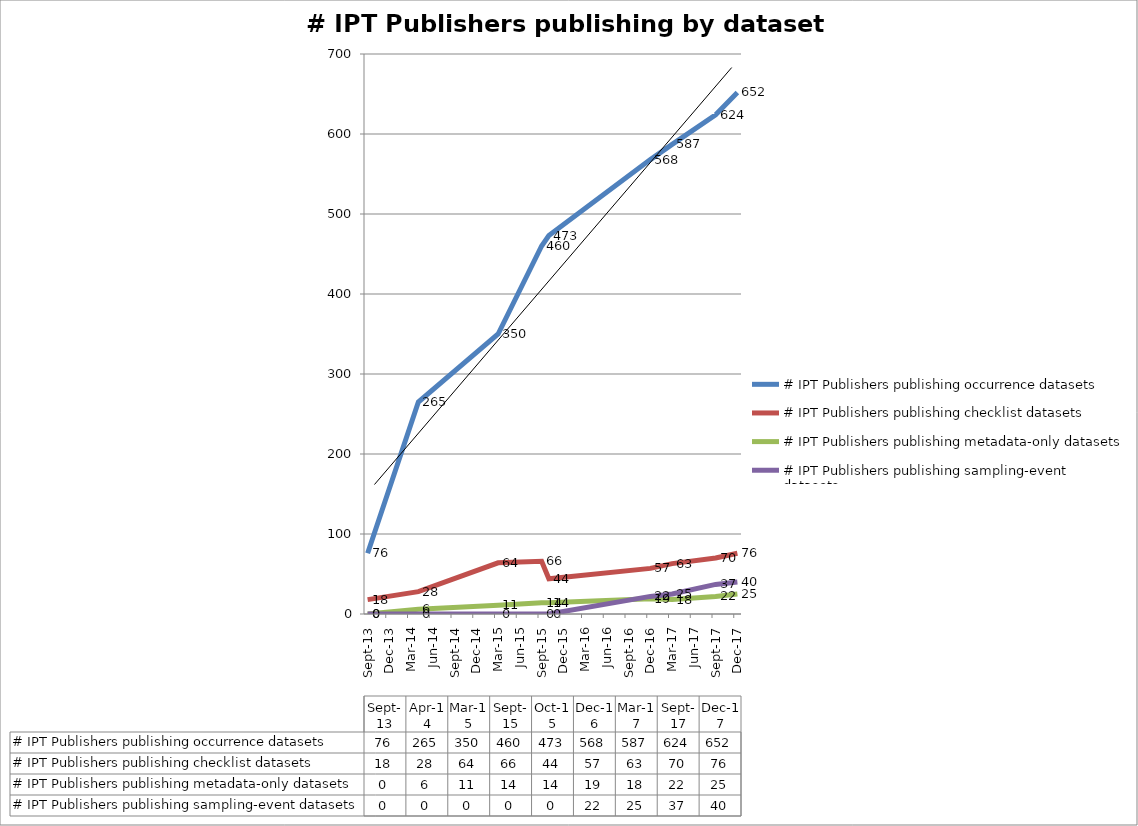
| Category | # IPT Publishers publishing occurrence datasets | # IPT Publishers publishing checklist datasets  | # IPT Publishers publishing metadata-only datasets | # IPT Publishers publishing sampling-event datasets |
|---|---|---|---|---|
| 2013-09-01 | 76 | 18 | 0 | 0 |
| 2014-04-01 | 265 | 28 | 6 | 0 |
| 2015-03-01 | 350 | 64 | 11 | 0 |
| 2015-09-01 | 460 | 66 | 14 | 0 |
| 2015-10-16 | 473 | 44 | 14 | 0 |
| 2016-12-01 | 568 | 57 | 19 | 22 |
| 2017-03-01 | 587 | 63 | 18 | 25 |
| 2017-09-20 | 624 | 70 | 22 | 37 |
| 2017-12-04 | 652 | 76 | 25 | 40 |